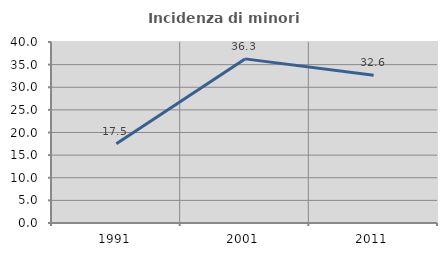
| Category | Incidenza di minori stranieri |
|---|---|
| 1991.0 | 17.5 |
| 2001.0 | 36.27 |
| 2011.0 | 32.637 |